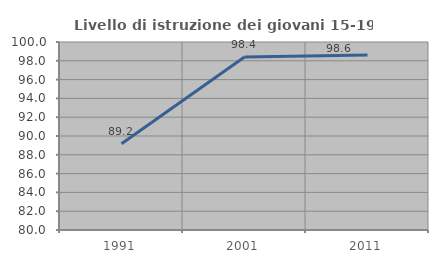
| Category | Livello di istruzione dei giovani 15-19 anni |
|---|---|
| 1991.0 | 89.173 |
| 2001.0 | 98.413 |
| 2011.0 | 98.614 |